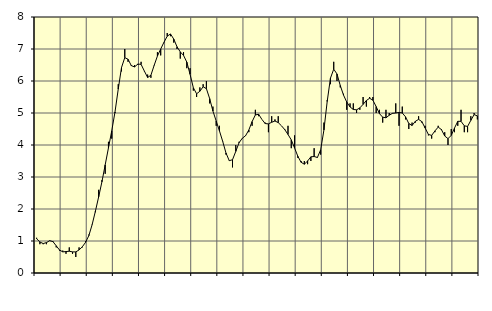
| Category | Piggar | Series 1 |
|---|---|---|
| nan | 1.1 | 1.07 |
| 87.0 | 0.9 | 0.97 |
| 87.0 | 0.9 | 0.92 |
| 87.0 | 0.9 | 0.95 |
| nan | 1 | 1.01 |
| 88.0 | 1 | 0.98 |
| 88.0 | 0.8 | 0.85 |
| 88.0 | 0.7 | 0.72 |
| nan | 0.7 | 0.66 |
| 89.0 | 0.6 | 0.67 |
| 89.0 | 0.8 | 0.68 |
| 89.0 | 0.6 | 0.66 |
| nan | 0.5 | 0.66 |
| 90.0 | 0.8 | 0.72 |
| 90.0 | 0.8 | 0.82 |
| 90.0 | 1 | 0.96 |
| nan | 1.2 | 1.17 |
| 91.0 | 1.5 | 1.51 |
| 91.0 | 1.9 | 1.93 |
| 91.0 | 2.6 | 2.38 |
| nan | 2.9 | 2.85 |
| 92.0 | 3.1 | 3.38 |
| 92.0 | 4.1 | 3.91 |
| 92.0 | 4.2 | 4.44 |
| nan | 5 | 5.03 |
| 93.0 | 5.9 | 5.75 |
| 93.0 | 6.3 | 6.42 |
| 93.0 | 7 | 6.73 |
| nan | 6.6 | 6.68 |
| 94.0 | 6.5 | 6.48 |
| 94.0 | 6.5 | 6.44 |
| 94.0 | 6.5 | 6.53 |
| nan | 6.6 | 6.52 |
| 95.0 | 6.3 | 6.31 |
| 95.0 | 6.2 | 6.11 |
| 95.0 | 6.1 | 6.18 |
| nan | 6.5 | 6.49 |
| 96.0 | 6.9 | 6.78 |
| 96.0 | 6.8 | 7 |
| 96.0 | 7.2 | 7.21 |
| nan | 7.5 | 7.4 |
| 97.0 | 7.4 | 7.47 |
| 97.0 | 7.2 | 7.31 |
| 97.0 | 7 | 7.07 |
| nan | 6.7 | 6.91 |
| 98.0 | 6.9 | 6.8 |
| 98.0 | 6.4 | 6.59 |
| 98.0 | 6.4 | 6.21 |
| nan | 5.7 | 5.79 |
| 99.0 | 5.5 | 5.6 |
| 99.0 | 5.8 | 5.68 |
| 99.0 | 5.9 | 5.82 |
| nan | 6 | 5.76 |
| 0.0 | 5.3 | 5.45 |
| 0.0 | 5.2 | 5.06 |
| 0.0 | 4.6 | 4.75 |
| nan | 4.6 | 4.44 |
| 1.0 | 4.1 | 4.11 |
| 1.0 | 3.7 | 3.75 |
| 1.0 | 3.5 | 3.51 |
| nan | 3.3 | 3.54 |
| 2.0 | 4 | 3.8 |
| 2.0 | 4.1 | 4.07 |
| 2.0 | 4.2 | 4.21 |
| nan | 4.3 | 4.29 |
| 3.0 | 4.4 | 4.47 |
| 3.0 | 4.6 | 4.73 |
| 3.0 | 5.1 | 4.94 |
| nan | 4.9 | 4.96 |
| 4.0 | 4.8 | 4.8 |
| 4.0 | 4.7 | 4.67 |
| 4.0 | 4.4 | 4.66 |
| nan | 4.9 | 4.71 |
| 5.0 | 4.8 | 4.75 |
| 5.0 | 4.9 | 4.7 |
| 5.0 | 4.6 | 4.6 |
| nan | 4.5 | 4.48 |
| 6.0 | 4.6 | 4.33 |
| 6.0 | 3.9 | 4.16 |
| 6.0 | 4.3 | 3.91 |
| nan | 3.6 | 3.65 |
| 7.0 | 3.5 | 3.46 |
| 7.0 | 3.5 | 3.4 |
| 7.0 | 3.4 | 3.5 |
| nan | 3.5 | 3.63 |
| 8.0 | 3.9 | 3.64 |
| 8.0 | 3.6 | 3.61 |
| 8.0 | 3.7 | 3.85 |
| nan | 4.7 | 4.47 |
| 9.0 | 5.4 | 5.36 |
| 9.0 | 5.9 | 6.09 |
| 9.0 | 6.6 | 6.37 |
| nan | 6 | 6.22 |
| 10.0 | 5.8 | 5.86 |
| 10.0 | 5.6 | 5.56 |
| 10.0 | 5.1 | 5.34 |
| nan | 5.3 | 5.19 |
| 11.0 | 5.3 | 5.11 |
| 11.0 | 5 | 5.1 |
| 11.0 | 5.1 | 5.16 |
| nan | 5.5 | 5.27 |
| 12.0 | 5.2 | 5.39 |
| 12.0 | 5.5 | 5.46 |
| 12.0 | 5.5 | 5.4 |
| nan | 5 | 5.2 |
| 13.0 | 5.1 | 4.98 |
| 13.0 | 4.7 | 4.87 |
| 13.0 | 5.1 | 4.85 |
| nan | 5 | 4.93 |
| 14.0 | 5 | 4.99 |
| 14.0 | 5.3 | 5 |
| 14.0 | 4.6 | 5.02 |
| nan | 5.2 | 5 |
| 15.0 | 4.8 | 4.88 |
| 15.0 | 4.5 | 4.67 |
| 15.0 | 4.7 | 4.61 |
| nan | 4.7 | 4.74 |
| 16.0 | 4.9 | 4.8 |
| 16.0 | 4.7 | 4.73 |
| 16.0 | 4.6 | 4.53 |
| nan | 4.3 | 4.33 |
| 17.0 | 4.2 | 4.3 |
| 17.0 | 4.4 | 4.44 |
| 17.0 | 4.6 | 4.56 |
| nan | 4.5 | 4.48 |
| 18.0 | 4.4 | 4.28 |
| 18.0 | 4 | 4.2 |
| 18.0 | 4.5 | 4.3 |
| nan | 4.4 | 4.53 |
| 19.0 | 4.6 | 4.74 |
| 19.0 | 5.1 | 4.74 |
| 19.0 | 4.4 | 4.6 |
| nan | 4.4 | 4.58 |
| 20.0 | 4.9 | 4.77 |
| 20.0 | 5 | 4.95 |
| 20.0 | 4.8 | 4.91 |